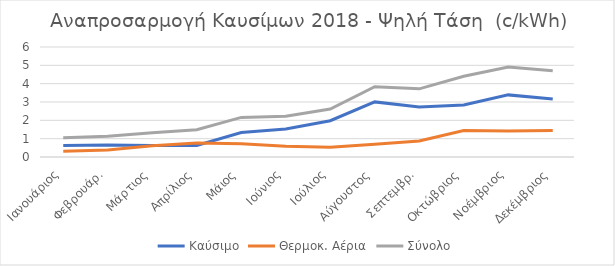
| Category | Καύσιμο | Θερμοκ. Αέρια | Σύνολο |
|---|---|---|---|
| Ιανουάριος | 0.626 | 0.32 | 1.05 |
| Φεβρουάρ. | 0.653 | 0.386 | 1.125 |
| Μάρτιος | 0.625 | 0.616 | 1.323 |
| Απρίλιος | 0.628 | 0.76 | 1.488 |
| Μάιος | 1.332 | 0.717 | 2.16 |
| Ιούνιος | 1.53 | 0.583 | 2.219 |
| Ιούλιος | 1.979 | 0.534 | 2.615 |
| Αύγουστος | 3.006 | 0.693 | 3.835 |
| Σεπτεμβρ. | 2.732 | 0.869 | 3.717 |
| Οκτώβριος | 2.836 | 1.445 | 4.407 |
| Νοέμβριος | 3.388 | 1.416 | 4.913 |
| Δεκέμβριος | 3.162 | 1.443 | 4.706 |